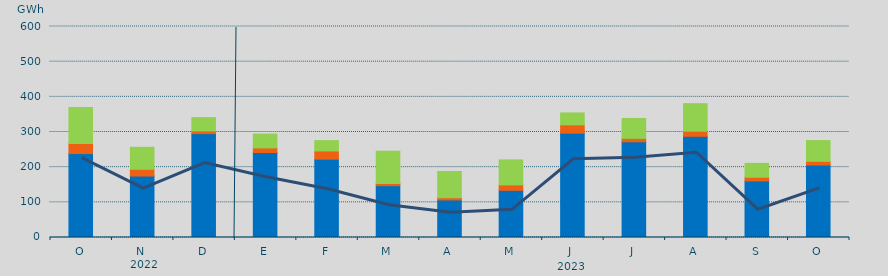
| Category | Asignación SEPE | Asignación Francia | Asignación Portugal |
|---|---|---|---|
| O | 238619.175 | 28420.1 | 102571.3 |
| N | 174742.7 | 19231.9 | 62469.6 |
| D | 295334.825 | 7715.1 | 37807.2 |
| E | 241649.025 | 13030.5 | 39359.9 |
| F | 222841.2 | 23234.4 | 29375.8 |
| M | 147441.275 | 6126.3 | 91808.3 |
| A | 106835.5 | 6210.9 | 74632.6 |
| M | 134157.925 | 15418.6 | 70990 |
| J | 296773.85 | 23610.9 | 33804.6 |
| J | 272106 | 9754 | 56632.6 |
| A | 287813.1 | 14419.4 | 78281 |
| S | 160873.1 | 10544 | 39388.9 |
| O | 206141.775 | 10508.8 | 58942.5 |